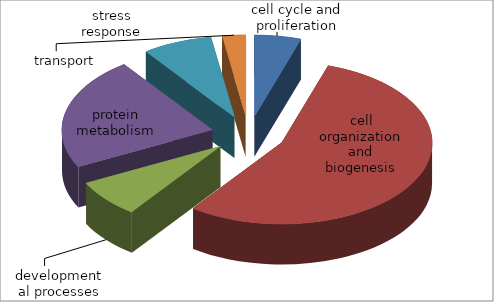
| Category | Series 0 |
|---|---|
| cell cycle and proliferation | 2 |
| cell organization and biogenesis | 22 |
| developmental processes | 3 |
| protein metabolism | 9 |
| stress response | 3 |
| transport | 1 |